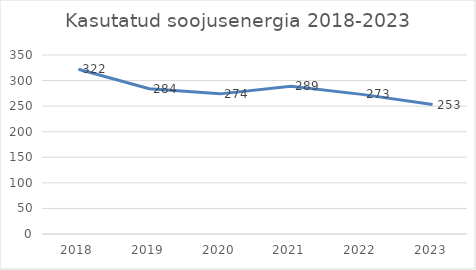
| Category | Series 0 |
|---|---|
| 2018.0 | 322 |
| 2019.0 | 284 |
| 2020.0 | 274 |
| 2021.0 | 289 |
| 2022.0 | 273 |
| 2023.0 | 253 |